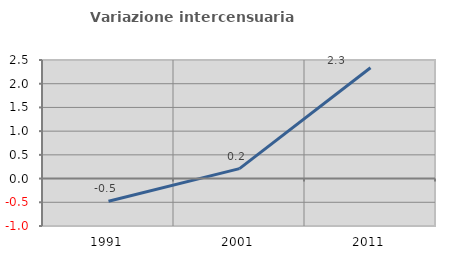
| Category | Variazione intercensuaria annua |
|---|---|
| 1991.0 | -0.479 |
| 2001.0 | 0.209 |
| 2011.0 | 2.337 |